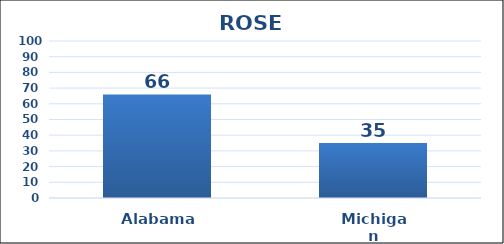
| Category | Series 0 |
|---|---|
| Alabama | 66 |
| Michigan | 35 |